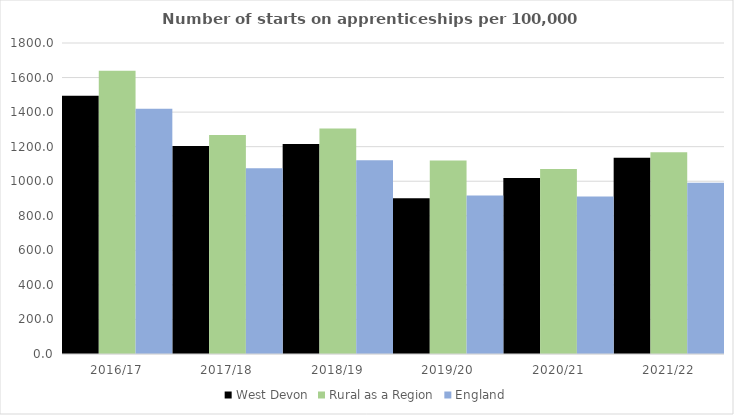
| Category | West Devon | Rural as a Region | England |
|---|---|---|---|
| 2016/17 | 1495 | 1638.789 | 1420 |
| 2017/18 | 1204 | 1267.474 | 1075 |
| 2018/19 | 1216 | 1304.57 | 1122 |
| 2019/20 | 901 | 1119.662 | 918 |
| 2020/21 | 1018 | 1070.748 | 912 |
| 2021/22 | 1136 | 1167.68 | 991 |